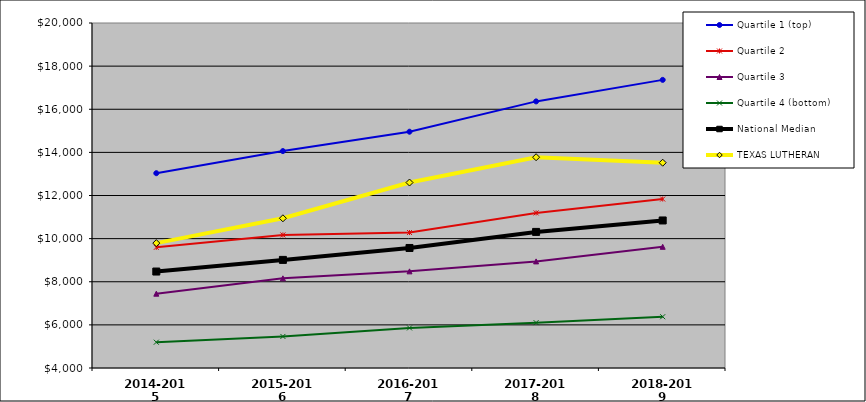
| Category | Quartile 1 (top) | Quartile 2 | Quartile 3 | Quartile 4 (bottom) | National Median | TEXAS LUTHERAN |
|---|---|---|---|---|---|---|
| 2014-2015 | 13034.131 | 9595.221 | 7445.738 | 5195.874 | 8473.314 | 9792.02 |
| 2015-2016 | 14060.149 | 10170.298 | 8158.514 | 5463.176 | 9013.486 | 10943.363 |
| 2016-2017 | 14958.631 | 10282.939 | 8482.205 | 5859.406 | 9566.64 | 12600.824 |
| 2017-2018 | 16364.416 | 11192.04 | 8943.5 | 6103.624 | 10311.147 | 13775.86 |
| 2018-2019 | 17362.146 | 11836.529 | 9620.385 | 6378.153 | 10842.044 | 13520.988 |